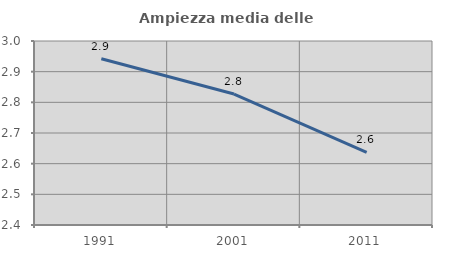
| Category | Ampiezza media delle famiglie |
|---|---|
| 1991.0 | 2.942 |
| 2001.0 | 2.827 |
| 2011.0 | 2.637 |